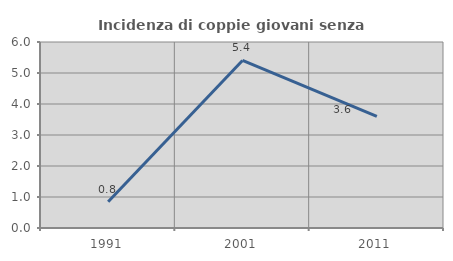
| Category | Incidenza di coppie giovani senza figli |
|---|---|
| 1991.0 | 0.847 |
| 2001.0 | 5.405 |
| 2011.0 | 3.604 |